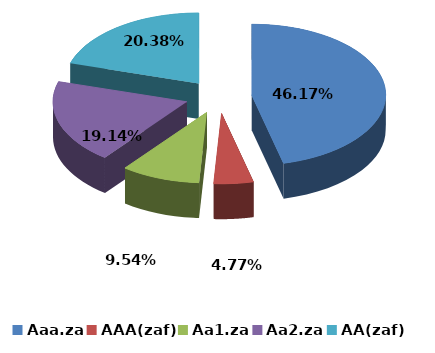
| Category | Series 0 |
|---|---|
| Aaa.za | 0.462 |
| AAA(zaf) | 0.048 |
| Aa1.za | 0.095 |
| Aa2.za | 0.191 |
| AA(zaf) | 0.204 |